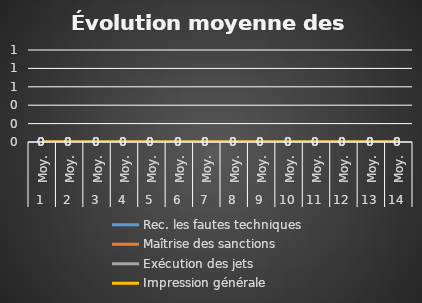
| Category | Rec. les fautes techniques  | Maîtrise des sanctions | Exécution des jets | Impression générale  |
|---|---|---|---|---|
| 0 | 0 | 0 | 0 | 0 |
| 1 | 0 | 0 | 0 | 0 |
| 2 | 0 | 0 | 0 | 0 |
| 3 | 0 | 0 | 0 | 0 |
| 4 | 0 | 0 | 0 | 0 |
| 5 | 0 | 0 | 0 | 0 |
| 6 | 0 | 0 | 0 | 0 |
| 7 | 0 | 0 | 0 | 0 |
| 8 | 0 | 0 | 0 | 0 |
| 9 | 0 | 0 | 0 | 0 |
| 10 | 0 | 0 | 0 | 0 |
| 11 | 0 | 0 | 0 | 0 |
| 12 | 0 | 0 | 0 | 0 |
| 13 | 0 | 0 | 0 | 0 |